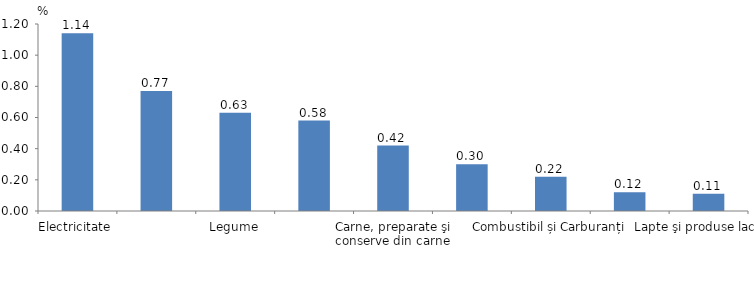
| Category |  gradul de influență  (+/-) asupra IPC, %  |
|---|---|
| Electricitate  | 1.14 |
| Gaze din rețea | 0.77 |
| Legume | 0.63 |
| Încălzire centrală | 0.58 |
| Carne, preparate şi conserve din carne | 0.42 |
| Produse de morărit şi panificaţie | 0.3 |
| Combustibil și Carburanți | 0.22 |
| Servicii de transport | 0.12 |
| Lapte şi produse lactate | 0.11 |